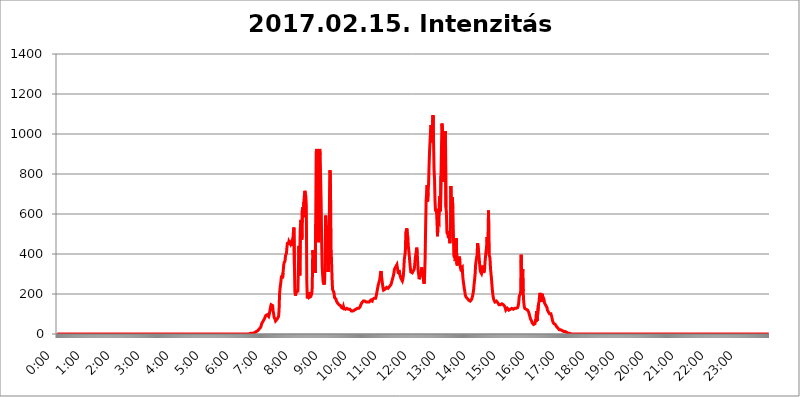
| Category | 2017.02.15. Intenzitás [W/m^2] |
|---|---|
| 0.0 | 0 |
| 0.0006944444444444445 | 0 |
| 0.001388888888888889 | 0 |
| 0.0020833333333333333 | 0 |
| 0.002777777777777778 | 0 |
| 0.003472222222222222 | 0 |
| 0.004166666666666667 | 0 |
| 0.004861111111111111 | 0 |
| 0.005555555555555556 | 0 |
| 0.0062499999999999995 | 0 |
| 0.006944444444444444 | 0 |
| 0.007638888888888889 | 0 |
| 0.008333333333333333 | 0 |
| 0.009027777777777779 | 0 |
| 0.009722222222222222 | 0 |
| 0.010416666666666666 | 0 |
| 0.011111111111111112 | 0 |
| 0.011805555555555555 | 0 |
| 0.012499999999999999 | 0 |
| 0.013194444444444444 | 0 |
| 0.013888888888888888 | 0 |
| 0.014583333333333332 | 0 |
| 0.015277777777777777 | 0 |
| 0.015972222222222224 | 0 |
| 0.016666666666666666 | 0 |
| 0.017361111111111112 | 0 |
| 0.018055555555555557 | 0 |
| 0.01875 | 0 |
| 0.019444444444444445 | 0 |
| 0.02013888888888889 | 0 |
| 0.020833333333333332 | 0 |
| 0.02152777777777778 | 0 |
| 0.022222222222222223 | 0 |
| 0.02291666666666667 | 0 |
| 0.02361111111111111 | 0 |
| 0.024305555555555556 | 0 |
| 0.024999999999999998 | 0 |
| 0.025694444444444447 | 0 |
| 0.02638888888888889 | 0 |
| 0.027083333333333334 | 0 |
| 0.027777777777777776 | 0 |
| 0.02847222222222222 | 0 |
| 0.029166666666666664 | 0 |
| 0.029861111111111113 | 0 |
| 0.030555555555555555 | 0 |
| 0.03125 | 0 |
| 0.03194444444444445 | 0 |
| 0.03263888888888889 | 0 |
| 0.03333333333333333 | 0 |
| 0.034027777777777775 | 0 |
| 0.034722222222222224 | 0 |
| 0.035416666666666666 | 0 |
| 0.036111111111111115 | 0 |
| 0.03680555555555556 | 0 |
| 0.0375 | 0 |
| 0.03819444444444444 | 0 |
| 0.03888888888888889 | 0 |
| 0.03958333333333333 | 0 |
| 0.04027777777777778 | 0 |
| 0.04097222222222222 | 0 |
| 0.041666666666666664 | 0 |
| 0.042361111111111106 | 0 |
| 0.04305555555555556 | 0 |
| 0.043750000000000004 | 0 |
| 0.044444444444444446 | 0 |
| 0.04513888888888889 | 0 |
| 0.04583333333333334 | 0 |
| 0.04652777777777778 | 0 |
| 0.04722222222222222 | 0 |
| 0.04791666666666666 | 0 |
| 0.04861111111111111 | 0 |
| 0.049305555555555554 | 0 |
| 0.049999999999999996 | 0 |
| 0.05069444444444445 | 0 |
| 0.051388888888888894 | 0 |
| 0.052083333333333336 | 0 |
| 0.05277777777777778 | 0 |
| 0.05347222222222222 | 0 |
| 0.05416666666666667 | 0 |
| 0.05486111111111111 | 0 |
| 0.05555555555555555 | 0 |
| 0.05625 | 0 |
| 0.05694444444444444 | 0 |
| 0.057638888888888885 | 0 |
| 0.05833333333333333 | 0 |
| 0.05902777777777778 | 0 |
| 0.059722222222222225 | 0 |
| 0.06041666666666667 | 0 |
| 0.061111111111111116 | 0 |
| 0.06180555555555556 | 0 |
| 0.0625 | 0 |
| 0.06319444444444444 | 0 |
| 0.06388888888888888 | 0 |
| 0.06458333333333334 | 0 |
| 0.06527777777777778 | 0 |
| 0.06597222222222222 | 0 |
| 0.06666666666666667 | 0 |
| 0.06736111111111111 | 0 |
| 0.06805555555555555 | 0 |
| 0.06874999999999999 | 0 |
| 0.06944444444444443 | 0 |
| 0.07013888888888889 | 0 |
| 0.07083333333333333 | 0 |
| 0.07152777777777779 | 0 |
| 0.07222222222222223 | 0 |
| 0.07291666666666667 | 0 |
| 0.07361111111111111 | 0 |
| 0.07430555555555556 | 0 |
| 0.075 | 0 |
| 0.07569444444444444 | 0 |
| 0.0763888888888889 | 0 |
| 0.07708333333333334 | 0 |
| 0.07777777777777778 | 0 |
| 0.07847222222222222 | 0 |
| 0.07916666666666666 | 0 |
| 0.0798611111111111 | 0 |
| 0.08055555555555556 | 0 |
| 0.08125 | 0 |
| 0.08194444444444444 | 0 |
| 0.08263888888888889 | 0 |
| 0.08333333333333333 | 0 |
| 0.08402777777777777 | 0 |
| 0.08472222222222221 | 0 |
| 0.08541666666666665 | 0 |
| 0.08611111111111112 | 0 |
| 0.08680555555555557 | 0 |
| 0.08750000000000001 | 0 |
| 0.08819444444444445 | 0 |
| 0.08888888888888889 | 0 |
| 0.08958333333333333 | 0 |
| 0.09027777777777778 | 0 |
| 0.09097222222222222 | 0 |
| 0.09166666666666667 | 0 |
| 0.09236111111111112 | 0 |
| 0.09305555555555556 | 0 |
| 0.09375 | 0 |
| 0.09444444444444444 | 0 |
| 0.09513888888888888 | 0 |
| 0.09583333333333333 | 0 |
| 0.09652777777777777 | 0 |
| 0.09722222222222222 | 0 |
| 0.09791666666666667 | 0 |
| 0.09861111111111111 | 0 |
| 0.09930555555555555 | 0 |
| 0.09999999999999999 | 0 |
| 0.10069444444444443 | 0 |
| 0.1013888888888889 | 0 |
| 0.10208333333333335 | 0 |
| 0.10277777777777779 | 0 |
| 0.10347222222222223 | 0 |
| 0.10416666666666667 | 0 |
| 0.10486111111111111 | 0 |
| 0.10555555555555556 | 0 |
| 0.10625 | 0 |
| 0.10694444444444444 | 0 |
| 0.1076388888888889 | 0 |
| 0.10833333333333334 | 0 |
| 0.10902777777777778 | 0 |
| 0.10972222222222222 | 0 |
| 0.1111111111111111 | 0 |
| 0.11180555555555556 | 0 |
| 0.11180555555555556 | 0 |
| 0.1125 | 0 |
| 0.11319444444444444 | 0 |
| 0.11388888888888889 | 0 |
| 0.11458333333333333 | 0 |
| 0.11527777777777777 | 0 |
| 0.11597222222222221 | 0 |
| 0.11666666666666665 | 0 |
| 0.1173611111111111 | 0 |
| 0.11805555555555557 | 0 |
| 0.11944444444444445 | 0 |
| 0.12013888888888889 | 0 |
| 0.12083333333333333 | 0 |
| 0.12152777777777778 | 0 |
| 0.12222222222222223 | 0 |
| 0.12291666666666667 | 0 |
| 0.12291666666666667 | 0 |
| 0.12361111111111112 | 0 |
| 0.12430555555555556 | 0 |
| 0.125 | 0 |
| 0.12569444444444444 | 0 |
| 0.12638888888888888 | 0 |
| 0.12708333333333333 | 0 |
| 0.16875 | 0 |
| 0.12847222222222224 | 0 |
| 0.12916666666666668 | 0 |
| 0.12986111111111112 | 0 |
| 0.13055555555555556 | 0 |
| 0.13125 | 0 |
| 0.13194444444444445 | 0 |
| 0.1326388888888889 | 0 |
| 0.13333333333333333 | 0 |
| 0.13402777777777777 | 0 |
| 0.13402777777777777 | 0 |
| 0.13472222222222222 | 0 |
| 0.13541666666666666 | 0 |
| 0.1361111111111111 | 0 |
| 0.13749999999999998 | 0 |
| 0.13819444444444443 | 0 |
| 0.1388888888888889 | 0 |
| 0.13958333333333334 | 0 |
| 0.14027777777777778 | 0 |
| 0.14097222222222222 | 0 |
| 0.14166666666666666 | 0 |
| 0.1423611111111111 | 0 |
| 0.14305555555555557 | 0 |
| 0.14375000000000002 | 0 |
| 0.14444444444444446 | 0 |
| 0.1451388888888889 | 0 |
| 0.1451388888888889 | 0 |
| 0.14652777777777778 | 0 |
| 0.14722222222222223 | 0 |
| 0.14791666666666667 | 0 |
| 0.1486111111111111 | 0 |
| 0.14930555555555555 | 0 |
| 0.15 | 0 |
| 0.15069444444444444 | 0 |
| 0.15138888888888888 | 0 |
| 0.15208333333333332 | 0 |
| 0.15277777777777776 | 0 |
| 0.15347222222222223 | 0 |
| 0.15416666666666667 | 0 |
| 0.15486111111111112 | 0 |
| 0.15555555555555556 | 0 |
| 0.15625 | 0 |
| 0.15694444444444444 | 0 |
| 0.15763888888888888 | 0 |
| 0.15833333333333333 | 0 |
| 0.15902777777777777 | 0 |
| 0.15972222222222224 | 0 |
| 0.16041666666666668 | 0 |
| 0.16111111111111112 | 0 |
| 0.16180555555555556 | 0 |
| 0.1625 | 0 |
| 0.16319444444444445 | 0 |
| 0.1638888888888889 | 0 |
| 0.16458333333333333 | 0 |
| 0.16527777777777777 | 0 |
| 0.16597222222222222 | 0 |
| 0.16666666666666666 | 0 |
| 0.1673611111111111 | 0 |
| 0.16805555555555554 | 0 |
| 0.16874999999999998 | 0 |
| 0.16944444444444443 | 0 |
| 0.17013888888888887 | 0 |
| 0.1708333333333333 | 0 |
| 0.17152777777777775 | 0 |
| 0.17222222222222225 | 0 |
| 0.1729166666666667 | 0 |
| 0.17361111111111113 | 0 |
| 0.17430555555555557 | 0 |
| 0.17500000000000002 | 0 |
| 0.17569444444444446 | 0 |
| 0.1763888888888889 | 0 |
| 0.17708333333333334 | 0 |
| 0.17777777777777778 | 0 |
| 0.17847222222222223 | 0 |
| 0.17916666666666667 | 0 |
| 0.1798611111111111 | 0 |
| 0.18055555555555555 | 0 |
| 0.18125 | 0 |
| 0.18194444444444444 | 0 |
| 0.1826388888888889 | 0 |
| 0.18333333333333335 | 0 |
| 0.1840277777777778 | 0 |
| 0.18472222222222223 | 0 |
| 0.18541666666666667 | 0 |
| 0.18611111111111112 | 0 |
| 0.18680555555555556 | 0 |
| 0.1875 | 0 |
| 0.18819444444444444 | 0 |
| 0.18888888888888888 | 0 |
| 0.18958333333333333 | 0 |
| 0.19027777777777777 | 0 |
| 0.1909722222222222 | 0 |
| 0.19166666666666665 | 0 |
| 0.19236111111111112 | 0 |
| 0.19305555555555554 | 0 |
| 0.19375 | 0 |
| 0.19444444444444445 | 0 |
| 0.1951388888888889 | 0 |
| 0.19583333333333333 | 0 |
| 0.19652777777777777 | 0 |
| 0.19722222222222222 | 0 |
| 0.19791666666666666 | 0 |
| 0.1986111111111111 | 0 |
| 0.19930555555555554 | 0 |
| 0.19999999999999998 | 0 |
| 0.20069444444444443 | 0 |
| 0.20138888888888887 | 0 |
| 0.2020833333333333 | 0 |
| 0.2027777777777778 | 0 |
| 0.2034722222222222 | 0 |
| 0.2041666666666667 | 0 |
| 0.20486111111111113 | 0 |
| 0.20555555555555557 | 0 |
| 0.20625000000000002 | 0 |
| 0.20694444444444446 | 0 |
| 0.2076388888888889 | 0 |
| 0.20833333333333334 | 0 |
| 0.20902777777777778 | 0 |
| 0.20972222222222223 | 0 |
| 0.21041666666666667 | 0 |
| 0.2111111111111111 | 0 |
| 0.21180555555555555 | 0 |
| 0.2125 | 0 |
| 0.21319444444444444 | 0 |
| 0.2138888888888889 | 0 |
| 0.21458333333333335 | 0 |
| 0.2152777777777778 | 0 |
| 0.21597222222222223 | 0 |
| 0.21666666666666667 | 0 |
| 0.21736111111111112 | 0 |
| 0.21805555555555556 | 0 |
| 0.21875 | 0 |
| 0.21944444444444444 | 0 |
| 0.22013888888888888 | 0 |
| 0.22083333333333333 | 0 |
| 0.22152777777777777 | 0 |
| 0.2222222222222222 | 0 |
| 0.22291666666666665 | 0 |
| 0.2236111111111111 | 0 |
| 0.22430555555555556 | 0 |
| 0.225 | 0 |
| 0.22569444444444445 | 0 |
| 0.2263888888888889 | 0 |
| 0.22708333333333333 | 0 |
| 0.22777777777777777 | 0 |
| 0.22847222222222222 | 0 |
| 0.22916666666666666 | 0 |
| 0.2298611111111111 | 0 |
| 0.23055555555555554 | 0 |
| 0.23124999999999998 | 0 |
| 0.23194444444444443 | 0 |
| 0.23263888888888887 | 0 |
| 0.2333333333333333 | 0 |
| 0.2340277777777778 | 0 |
| 0.2347222222222222 | 0 |
| 0.2354166666666667 | 0 |
| 0.23611111111111113 | 0 |
| 0.23680555555555557 | 0 |
| 0.23750000000000002 | 0 |
| 0.23819444444444446 | 0 |
| 0.2388888888888889 | 0 |
| 0.23958333333333334 | 0 |
| 0.24027777777777778 | 0 |
| 0.24097222222222223 | 0 |
| 0.24166666666666667 | 0 |
| 0.2423611111111111 | 0 |
| 0.24305555555555555 | 0 |
| 0.24375 | 0 |
| 0.24444444444444446 | 0 |
| 0.24513888888888888 | 0 |
| 0.24583333333333335 | 0 |
| 0.2465277777777778 | 0 |
| 0.24722222222222223 | 0 |
| 0.24791666666666667 | 0 |
| 0.24861111111111112 | 0 |
| 0.24930555555555556 | 0 |
| 0.25 | 0 |
| 0.25069444444444444 | 0 |
| 0.2513888888888889 | 0 |
| 0.2520833333333333 | 0 |
| 0.25277777777777777 | 0 |
| 0.2534722222222222 | 0 |
| 0.25416666666666665 | 0 |
| 0.2548611111111111 | 0 |
| 0.2555555555555556 | 0 |
| 0.25625000000000003 | 0 |
| 0.2569444444444445 | 0 |
| 0.2576388888888889 | 0 |
| 0.25833333333333336 | 0 |
| 0.2590277777777778 | 0 |
| 0.25972222222222224 | 0 |
| 0.2604166666666667 | 0 |
| 0.2611111111111111 | 0 |
| 0.26180555555555557 | 0 |
| 0.2625 | 0 |
| 0.26319444444444445 | 0 |
| 0.2638888888888889 | 0 |
| 0.26458333333333334 | 0 |
| 0.2652777777777778 | 0 |
| 0.2659722222222222 | 0 |
| 0.26666666666666666 | 0 |
| 0.2673611111111111 | 0 |
| 0.26805555555555555 | 0 |
| 0.26875 | 0 |
| 0.26944444444444443 | 0 |
| 0.2701388888888889 | 0 |
| 0.2708333333333333 | 3.525 |
| 0.27152777777777776 | 0 |
| 0.2722222222222222 | 3.525 |
| 0.27291666666666664 | 3.525 |
| 0.2736111111111111 | 3.525 |
| 0.2743055555555555 | 3.525 |
| 0.27499999999999997 | 3.525 |
| 0.27569444444444446 | 3.525 |
| 0.27638888888888885 | 3.525 |
| 0.27708333333333335 | 7.887 |
| 0.2777777777777778 | 7.887 |
| 0.27847222222222223 | 7.887 |
| 0.2791666666666667 | 12.257 |
| 0.2798611111111111 | 12.257 |
| 0.28055555555555556 | 16.636 |
| 0.28125 | 16.636 |
| 0.28194444444444444 | 21.024 |
| 0.2826388888888889 | 21.024 |
| 0.2833333333333333 | 25.419 |
| 0.28402777777777777 | 25.419 |
| 0.2847222222222222 | 29.823 |
| 0.28541666666666665 | 34.234 |
| 0.28611111111111115 | 43.079 |
| 0.28680555555555554 | 51.951 |
| 0.28750000000000003 | 56.398 |
| 0.2881944444444445 | 60.85 |
| 0.2888888888888889 | 65.31 |
| 0.28958333333333336 | 69.775 |
| 0.2902777777777778 | 74.246 |
| 0.29097222222222224 | 78.722 |
| 0.2916666666666667 | 83.205 |
| 0.2923611111111111 | 92.184 |
| 0.29305555555555557 | 96.682 |
| 0.29375 | 96.682 |
| 0.29444444444444445 | 96.682 |
| 0.2951388888888889 | 101.184 |
| 0.29583333333333334 | 92.184 |
| 0.2965277777777778 | 87.692 |
| 0.2972222222222222 | 96.682 |
| 0.29791666666666666 | 110.201 |
| 0.2986111111111111 | 123.758 |
| 0.29930555555555555 | 137.347 |
| 0.3 | 146.423 |
| 0.30069444444444443 | 150.964 |
| 0.3013888888888889 | 150.964 |
| 0.3020833333333333 | 141.884 |
| 0.30277777777777776 | 114.716 |
| 0.3034722222222222 | 101.184 |
| 0.30416666666666664 | 83.205 |
| 0.3048611111111111 | 78.722 |
| 0.3055555555555555 | 74.246 |
| 0.30624999999999997 | 65.31 |
| 0.3069444444444444 | 69.775 |
| 0.3076388888888889 | 69.775 |
| 0.30833333333333335 | 74.246 |
| 0.3090277777777778 | 74.246 |
| 0.30972222222222223 | 78.722 |
| 0.3104166666666667 | 87.692 |
| 0.3111111111111111 | 119.235 |
| 0.31180555555555556 | 201.058 |
| 0.3125 | 228.436 |
| 0.31319444444444444 | 246.689 |
| 0.3138888888888889 | 269.49 |
| 0.3145833333333333 | 292.259 |
| 0.31527777777777777 | 287.709 |
| 0.3159722222222222 | 278.603 |
| 0.31666666666666665 | 305.898 |
| 0.31736111111111115 | 333.113 |
| 0.31805555555555554 | 355.712 |
| 0.31875000000000003 | 351.198 |
| 0.3194444444444445 | 364.728 |
| 0.3201388888888889 | 391.685 |
| 0.32083333333333336 | 387.202 |
| 0.3215277777777778 | 405.108 |
| 0.32222222222222224 | 436.27 |
| 0.3229166666666667 | 458.38 |
| 0.3236111111111111 | 462.786 |
| 0.32430555555555557 | 445.129 |
| 0.325 | 462.786 |
| 0.32569444444444445 | 458.38 |
| 0.3263888888888889 | 458.38 |
| 0.32708333333333334 | 449.551 |
| 0.3277777777777778 | 458.38 |
| 0.3284722222222222 | 462.786 |
| 0.32916666666666666 | 467.187 |
| 0.3298611111111111 | 440.702 |
| 0.33055555555555555 | 475.972 |
| 0.33125 | 510.885 |
| 0.33194444444444443 | 532.513 |
| 0.3326388888888889 | 346.682 |
| 0.3333333333333333 | 210.182 |
| 0.3340277777777778 | 191.937 |
| 0.3347222222222222 | 191.937 |
| 0.3354166666666667 | 214.746 |
| 0.3361111111111111 | 210.182 |
| 0.3368055555555556 | 214.746 |
| 0.33749999999999997 | 214.746 |
| 0.33819444444444446 | 219.309 |
| 0.33888888888888885 | 440.702 |
| 0.33958333333333335 | 378.224 |
| 0.34027777777777773 | 292.259 |
| 0.34097222222222223 | 528.2 |
| 0.3416666666666666 | 571.049 |
| 0.3423611111111111 | 549.704 |
| 0.3430555555555555 | 471.582 |
| 0.34375 | 617.436 |
| 0.3444444444444445 | 634.105 |
| 0.3451388888888889 | 583.779 |
| 0.3458333333333334 | 658.909 |
| 0.34652777777777777 | 687.544 |
| 0.34722222222222227 | 715.858 |
| 0.34791666666666665 | 699.717 |
| 0.34861111111111115 | 691.608 |
| 0.34930555555555554 | 642.4 |
| 0.35000000000000003 | 264.932 |
| 0.3506944444444444 | 178.264 |
| 0.3513888888888889 | 182.82 |
| 0.3520833333333333 | 201.058 |
| 0.3527777777777778 | 210.182 |
| 0.3534722222222222 | 182.82 |
| 0.3541666666666667 | 187.378 |
| 0.3548611111111111 | 187.378 |
| 0.35555555555555557 | 187.378 |
| 0.35625 | 191.937 |
| 0.35694444444444445 | 201.058 |
| 0.3576388888888889 | 233 |
| 0.35833333333333334 | 418.492 |
| 0.3590277777777778 | 396.164 |
| 0.3597222222222222 | 414.035 |
| 0.36041666666666666 | 355.712 |
| 0.3611111111111111 | 400.638 |
| 0.36180555555555555 | 305.898 |
| 0.3625 | 549.704 |
| 0.36319444444444443 | 909.996 |
| 0.3638888888888889 | 925.06 |
| 0.3645833333333333 | 921.298 |
| 0.3652777777777778 | 868.305 |
| 0.3659722222222222 | 579.542 |
| 0.3666666666666667 | 458.38 |
| 0.3673611111111111 | 909.996 |
| 0.3680555555555556 | 925.06 |
| 0.36874999999999997 | 894.885 |
| 0.36944444444444446 | 894.885 |
| 0.37013888888888885 | 654.791 |
| 0.37083333333333335 | 462.786 |
| 0.37152777777777773 | 337.639 |
| 0.37222222222222223 | 296.808 |
| 0.3729166666666666 | 260.373 |
| 0.3736111111111111 | 255.813 |
| 0.3743055555555555 | 246.689 |
| 0.375 | 264.932 |
| 0.3756944444444445 | 369.23 |
| 0.3763888888888889 | 592.233 |
| 0.3770833333333334 | 549.704 |
| 0.37777777777777777 | 541.121 |
| 0.37847222222222227 | 355.712 |
| 0.37916666666666665 | 378.224 |
| 0.37986111111111115 | 310.44 |
| 0.38055555555555554 | 346.682 |
| 0.38125000000000003 | 405.108 |
| 0.3819444444444444 | 727.896 |
| 0.3826388888888889 | 818.392 |
| 0.3833333333333333 | 703.762 |
| 0.3840277777777778 | 431.833 |
| 0.3847222222222222 | 360.221 |
| 0.3854166666666667 | 278.603 |
| 0.3861111111111111 | 223.873 |
| 0.38680555555555557 | 219.309 |
| 0.3875 | 223.873 |
| 0.38819444444444445 | 205.62 |
| 0.3888888888888889 | 182.82 |
| 0.38958333333333334 | 178.264 |
| 0.3902777777777778 | 178.264 |
| 0.3909722222222222 | 173.709 |
| 0.39166666666666666 | 164.605 |
| 0.3923611111111111 | 160.056 |
| 0.39305555555555555 | 155.509 |
| 0.39375 | 150.964 |
| 0.39444444444444443 | 150.964 |
| 0.3951388888888889 | 146.423 |
| 0.3958333333333333 | 146.423 |
| 0.3965277777777778 | 141.884 |
| 0.3972222222222222 | 141.884 |
| 0.3979166666666667 | 137.347 |
| 0.3986111111111111 | 132.814 |
| 0.3993055555555556 | 132.814 |
| 0.39999999999999997 | 128.284 |
| 0.40069444444444446 | 128.284 |
| 0.40138888888888885 | 137.347 |
| 0.40208333333333335 | 128.284 |
| 0.40277777777777773 | 123.758 |
| 0.40347222222222223 | 123.758 |
| 0.4041666666666666 | 123.758 |
| 0.4048611111111111 | 123.758 |
| 0.4055555555555555 | 123.758 |
| 0.40625 | 128.284 |
| 0.4069444444444445 | 123.758 |
| 0.4076388888888889 | 123.758 |
| 0.4083333333333334 | 123.758 |
| 0.40902777777777777 | 123.758 |
| 0.40972222222222227 | 123.758 |
| 0.41041666666666665 | 123.758 |
| 0.41111111111111115 | 119.235 |
| 0.41180555555555554 | 119.235 |
| 0.41250000000000003 | 114.716 |
| 0.4131944444444444 | 114.716 |
| 0.4138888888888889 | 114.716 |
| 0.4145833333333333 | 114.716 |
| 0.4152777777777778 | 114.716 |
| 0.4159722222222222 | 114.716 |
| 0.4166666666666667 | 119.235 |
| 0.4173611111111111 | 119.235 |
| 0.41805555555555557 | 119.235 |
| 0.41875 | 123.758 |
| 0.41944444444444445 | 123.758 |
| 0.4201388888888889 | 123.758 |
| 0.42083333333333334 | 128.284 |
| 0.4215277777777778 | 128.284 |
| 0.4222222222222222 | 128.284 |
| 0.42291666666666666 | 128.284 |
| 0.4236111111111111 | 128.284 |
| 0.42430555555555555 | 132.814 |
| 0.425 | 137.347 |
| 0.42569444444444443 | 146.423 |
| 0.4263888888888889 | 150.964 |
| 0.4270833333333333 | 155.509 |
| 0.4277777777777778 | 155.509 |
| 0.4284722222222222 | 160.056 |
| 0.4291666666666667 | 164.605 |
| 0.4298611111111111 | 164.605 |
| 0.4305555555555556 | 164.605 |
| 0.43124999999999997 | 164.605 |
| 0.43194444444444446 | 164.605 |
| 0.43263888888888885 | 164.605 |
| 0.43333333333333335 | 160.056 |
| 0.43402777777777773 | 160.056 |
| 0.43472222222222223 | 160.056 |
| 0.4354166666666666 | 160.056 |
| 0.4361111111111111 | 160.056 |
| 0.4368055555555555 | 160.056 |
| 0.4375 | 160.056 |
| 0.4381944444444445 | 164.605 |
| 0.4388888888888889 | 164.605 |
| 0.4395833333333334 | 169.156 |
| 0.44027777777777777 | 169.156 |
| 0.44097222222222227 | 164.605 |
| 0.44166666666666665 | 164.605 |
| 0.44236111111111115 | 173.709 |
| 0.44305555555555554 | 169.156 |
| 0.44375000000000003 | 173.709 |
| 0.4444444444444444 | 178.264 |
| 0.4451388888888889 | 178.264 |
| 0.4458333333333333 | 173.709 |
| 0.4465277777777778 | 178.264 |
| 0.4472222222222222 | 187.378 |
| 0.4479166666666667 | 201.058 |
| 0.4486111111111111 | 214.746 |
| 0.44930555555555557 | 228.436 |
| 0.45 | 242.127 |
| 0.45069444444444445 | 251.251 |
| 0.4513888888888889 | 260.373 |
| 0.45208333333333334 | 269.49 |
| 0.4527777777777778 | 283.156 |
| 0.4534722222222222 | 305.898 |
| 0.45416666666666666 | 314.98 |
| 0.4548611111111111 | 287.709 |
| 0.45555555555555555 | 269.49 |
| 0.45625 | 246.689 |
| 0.45694444444444443 | 228.436 |
| 0.4576388888888889 | 219.309 |
| 0.4583333333333333 | 219.309 |
| 0.4590277777777778 | 219.309 |
| 0.4597222222222222 | 223.873 |
| 0.4604166666666667 | 228.436 |
| 0.4611111111111111 | 228.436 |
| 0.4618055555555556 | 233 |
| 0.46249999999999997 | 237.564 |
| 0.46319444444444446 | 233 |
| 0.46388888888888885 | 228.436 |
| 0.46458333333333335 | 228.436 |
| 0.46527777777777773 | 233 |
| 0.46597222222222223 | 237.564 |
| 0.4666666666666666 | 242.127 |
| 0.4673611111111111 | 242.127 |
| 0.4680555555555555 | 246.689 |
| 0.46875 | 255.813 |
| 0.4694444444444445 | 264.932 |
| 0.4701388888888889 | 274.047 |
| 0.4708333333333334 | 283.156 |
| 0.47152777777777777 | 292.259 |
| 0.47222222222222227 | 305.898 |
| 0.47291666666666665 | 324.052 |
| 0.47361111111111115 | 328.584 |
| 0.47430555555555554 | 333.113 |
| 0.47500000000000003 | 337.639 |
| 0.4756944444444444 | 337.639 |
| 0.4763888888888889 | 346.682 |
| 0.4770833333333333 | 342.162 |
| 0.4777777777777778 | 314.98 |
| 0.4784722222222222 | 301.354 |
| 0.4791666666666667 | 319.517 |
| 0.4798611111111111 | 314.98 |
| 0.48055555555555557 | 296.808 |
| 0.48125 | 287.709 |
| 0.48194444444444445 | 278.603 |
| 0.4826388888888889 | 278.603 |
| 0.48333333333333334 | 278.603 |
| 0.4840277777777778 | 264.932 |
| 0.4847222222222222 | 274.047 |
| 0.48541666666666666 | 292.259 |
| 0.4861111111111111 | 328.584 |
| 0.48680555555555555 | 373.729 |
| 0.4875 | 391.685 |
| 0.48819444444444443 | 409.574 |
| 0.4888888888888889 | 506.542 |
| 0.4895833333333333 | 506.542 |
| 0.4902777777777778 | 528.2 |
| 0.4909722222222222 | 497.836 |
| 0.4916666666666667 | 489.108 |
| 0.4923611111111111 | 440.702 |
| 0.4930555555555556 | 418.492 |
| 0.49374999999999997 | 391.685 |
| 0.49444444444444446 | 360.221 |
| 0.49513888888888885 | 333.113 |
| 0.49583333333333335 | 310.44 |
| 0.49652777777777773 | 305.898 |
| 0.49722222222222223 | 305.898 |
| 0.4979166666666666 | 305.898 |
| 0.4986111111111111 | 310.44 |
| 0.4993055555555555 | 314.98 |
| 0.5 | 314.98 |
| 0.5006944444444444 | 324.052 |
| 0.5013888888888889 | 346.682 |
| 0.5020833333333333 | 378.224 |
| 0.5027777777777778 | 378.224 |
| 0.5034722222222222 | 409.574 |
| 0.5041666666666667 | 431.833 |
| 0.5048611111111111 | 405.108 |
| 0.5055555555555555 | 355.712 |
| 0.50625 | 314.98 |
| 0.5069444444444444 | 296.808 |
| 0.5076388888888889 | 274.047 |
| 0.5083333333333333 | 269.49 |
| 0.5090277777777777 | 292.259 |
| 0.5097222222222222 | 296.808 |
| 0.5104166666666666 | 314.98 |
| 0.5111111111111112 | 333.113 |
| 0.5118055555555555 | 328.584 |
| 0.5125000000000001 | 333.113 |
| 0.5131944444444444 | 287.709 |
| 0.513888888888889 | 260.373 |
| 0.5145833333333333 | 251.251 |
| 0.5152777777777778 | 292.259 |
| 0.5159722222222222 | 378.224 |
| 0.5166666666666667 | 532.513 |
| 0.517361111111111 | 667.123 |
| 0.5180555555555556 | 703.762 |
| 0.5187499999999999 | 743.859 |
| 0.5194444444444445 | 663.019 |
| 0.5201388888888888 | 707.8 |
| 0.5208333333333334 | 751.803 |
| 0.5215277777777778 | 845.365 |
| 0.5222222222222223 | 917.534 |
| 0.5229166666666667 | 966.295 |
| 0.5236111111111111 | 1018.587 |
| 0.5243055555555556 | 1044.762 |
| 0.525 | 958.814 |
| 0.5256944444444445 | 1041.019 |
| 0.5263888888888889 | 1033.537 |
| 0.5270833333333333 | 1093.653 |
| 0.5277777777777778 | 966.295 |
| 0.5284722222222222 | 822.26 |
| 0.5291666666666667 | 775.492 |
| 0.5298611111111111 | 663.019 |
| 0.5305555555555556 | 613.252 |
| 0.53125 | 625.784 |
| 0.5319444444444444 | 613.252 |
| 0.5326388888888889 | 558.261 |
| 0.5333333333333333 | 489.108 |
| 0.5340277777777778 | 566.793 |
| 0.5347222222222222 | 566.793 |
| 0.5354166666666667 | 558.261 |
| 0.5361111111111111 | 687.544 |
| 0.5368055555555555 | 687.544 |
| 0.5375 | 613.252 |
| 0.5381944444444444 | 791.169 |
| 0.5388888888888889 | 928.819 |
| 0.5395833333333333 | 1052.255 |
| 0.5402777777777777 | 1014.852 |
| 0.5409722222222222 | 798.974 |
| 0.5416666666666666 | 977.508 |
| 0.5423611111111112 | 759.723 |
| 0.5430555555555555 | 759.723 |
| 0.5437500000000001 | 887.309 |
| 0.5444444444444444 | 1014.852 |
| 0.545138888888889 | 634.105 |
| 0.5458333333333333 | 609.062 |
| 0.5465277777777778 | 506.542 |
| 0.5472222222222222 | 506.542 |
| 0.5479166666666667 | 497.836 |
| 0.548611111111111 | 480.356 |
| 0.5493055555555556 | 515.223 |
| 0.5499999999999999 | 475.972 |
| 0.5506944444444445 | 453.968 |
| 0.5513888888888888 | 506.542 |
| 0.5520833333333334 | 739.877 |
| 0.5527777777777778 | 528.2 |
| 0.5534722222222223 | 523.88 |
| 0.5541666666666667 | 683.473 |
| 0.5548611111111111 | 625.784 |
| 0.5555555555555556 | 625.784 |
| 0.55625 | 391.685 |
| 0.5569444444444445 | 382.715 |
| 0.5576388888888889 | 396.164 |
| 0.5583333333333333 | 364.728 |
| 0.5590277777777778 | 360.221 |
| 0.5597222222222222 | 480.356 |
| 0.5604166666666667 | 351.198 |
| 0.5611111111111111 | 342.162 |
| 0.5618055555555556 | 369.23 |
| 0.5625 | 360.221 |
| 0.5631944444444444 | 378.224 |
| 0.5638888888888889 | 387.202 |
| 0.5645833333333333 | 369.23 |
| 0.5652777777777778 | 333.113 |
| 0.5659722222222222 | 324.052 |
| 0.5666666666666667 | 324.052 |
| 0.5673611111111111 | 319.517 |
| 0.5680555555555555 | 333.113 |
| 0.56875 | 287.709 |
| 0.5694444444444444 | 264.932 |
| 0.5701388888888889 | 246.689 |
| 0.5708333333333333 | 228.436 |
| 0.5715277777777777 | 214.746 |
| 0.5722222222222222 | 196.497 |
| 0.5729166666666666 | 187.378 |
| 0.5736111111111112 | 191.937 |
| 0.5743055555555555 | 187.378 |
| 0.5750000000000001 | 178.264 |
| 0.5756944444444444 | 173.709 |
| 0.576388888888889 | 173.709 |
| 0.5770833333333333 | 169.156 |
| 0.5777777777777778 | 169.156 |
| 0.5784722222222222 | 169.156 |
| 0.5791666666666667 | 164.605 |
| 0.579861111111111 | 164.605 |
| 0.5805555555555556 | 164.605 |
| 0.5812499999999999 | 173.709 |
| 0.5819444444444445 | 182.82 |
| 0.5826388888888888 | 191.937 |
| 0.5833333333333334 | 205.62 |
| 0.5840277777777778 | 223.873 |
| 0.5847222222222223 | 251.251 |
| 0.5854166666666667 | 274.047 |
| 0.5861111111111111 | 301.354 |
| 0.5868055555555556 | 346.682 |
| 0.5875 | 364.728 |
| 0.5881944444444445 | 382.715 |
| 0.5888888888888889 | 396.164 |
| 0.5895833333333333 | 453.968 |
| 0.5902777777777778 | 458.38 |
| 0.5909722222222222 | 409.574 |
| 0.5916666666666667 | 382.715 |
| 0.5923611111111111 | 351.198 |
| 0.5930555555555556 | 324.052 |
| 0.59375 | 310.44 |
| 0.5944444444444444 | 305.898 |
| 0.5951388888888889 | 301.354 |
| 0.5958333333333333 | 310.44 |
| 0.5965277777777778 | 342.162 |
| 0.5972222222222222 | 328.584 |
| 0.5979166666666667 | 305.898 |
| 0.5986111111111111 | 310.44 |
| 0.5993055555555555 | 319.517 |
| 0.6 | 360.221 |
| 0.6006944444444444 | 387.202 |
| 0.6013888888888889 | 414.035 |
| 0.6020833333333333 | 431.833 |
| 0.6027777777777777 | 484.735 |
| 0.6034722222222222 | 453.968 |
| 0.6041666666666666 | 480.356 |
| 0.6048611111111112 | 617.436 |
| 0.6055555555555555 | 400.638 |
| 0.6062500000000001 | 405.108 |
| 0.6069444444444444 | 378.224 |
| 0.607638888888889 | 328.584 |
| 0.6083333333333333 | 301.354 |
| 0.6090277777777778 | 278.603 |
| 0.6097222222222222 | 242.127 |
| 0.6104166666666667 | 214.746 |
| 0.611111111111111 | 191.937 |
| 0.6118055555555556 | 178.264 |
| 0.6124999999999999 | 169.156 |
| 0.6131944444444445 | 164.605 |
| 0.6138888888888888 | 160.056 |
| 0.6145833333333334 | 160.056 |
| 0.6152777777777778 | 160.056 |
| 0.6159722222222223 | 164.605 |
| 0.6166666666666667 | 164.605 |
| 0.6173611111111111 | 160.056 |
| 0.6180555555555556 | 155.509 |
| 0.61875 | 150.964 |
| 0.6194444444444445 | 146.423 |
| 0.6201388888888889 | 146.423 |
| 0.6208333333333333 | 146.423 |
| 0.6215277777777778 | 146.423 |
| 0.6222222222222222 | 146.423 |
| 0.6229166666666667 | 146.423 |
| 0.6236111111111111 | 150.964 |
| 0.6243055555555556 | 150.964 |
| 0.625 | 150.964 |
| 0.6256944444444444 | 146.423 |
| 0.6263888888888889 | 146.423 |
| 0.6270833333333333 | 146.423 |
| 0.6277777777777778 | 137.347 |
| 0.6284722222222222 | 128.284 |
| 0.6291666666666667 | 119.235 |
| 0.6298611111111111 | 119.235 |
| 0.6305555555555555 | 123.758 |
| 0.63125 | 128.284 |
| 0.6319444444444444 | 128.284 |
| 0.6326388888888889 | 123.758 |
| 0.6333333333333333 | 119.235 |
| 0.6340277777777777 | 119.235 |
| 0.6347222222222222 | 119.235 |
| 0.6354166666666666 | 123.758 |
| 0.6361111111111112 | 128.284 |
| 0.6368055555555555 | 128.284 |
| 0.6375000000000001 | 128.284 |
| 0.6381944444444444 | 128.284 |
| 0.638888888888889 | 123.758 |
| 0.6395833333333333 | 123.758 |
| 0.6402777777777778 | 123.758 |
| 0.6409722222222222 | 128.284 |
| 0.6416666666666667 | 128.284 |
| 0.642361111111111 | 128.284 |
| 0.6430555555555556 | 128.284 |
| 0.6437499999999999 | 128.284 |
| 0.6444444444444445 | 128.284 |
| 0.6451388888888888 | 128.284 |
| 0.6458333333333334 | 132.814 |
| 0.6465277777777778 | 141.884 |
| 0.6472222222222223 | 155.509 |
| 0.6479166666666667 | 187.378 |
| 0.6486111111111111 | 191.937 |
| 0.6493055555555556 | 201.058 |
| 0.65 | 214.746 |
| 0.6506944444444445 | 396.164 |
| 0.6513888888888889 | 196.497 |
| 0.6520833333333333 | 205.62 |
| 0.6527777777777778 | 324.052 |
| 0.6534722222222222 | 214.746 |
| 0.6541666666666667 | 164.605 |
| 0.6548611111111111 | 141.884 |
| 0.6555555555555556 | 128.284 |
| 0.65625 | 132.814 |
| 0.6569444444444444 | 123.758 |
| 0.6576388888888889 | 123.758 |
| 0.6583333333333333 | 123.758 |
| 0.6590277777777778 | 123.758 |
| 0.6597222222222222 | 119.235 |
| 0.6604166666666667 | 114.716 |
| 0.6611111111111111 | 110.201 |
| 0.6618055555555555 | 101.184 |
| 0.6625 | 92.184 |
| 0.6631944444444444 | 83.205 |
| 0.6638888888888889 | 74.246 |
| 0.6645833333333333 | 69.775 |
| 0.6652777777777777 | 65.31 |
| 0.6659722222222222 | 56.398 |
| 0.6666666666666666 | 56.398 |
| 0.6673611111111111 | 51.951 |
| 0.6680555555555556 | 47.511 |
| 0.6687500000000001 | 47.511 |
| 0.6694444444444444 | 47.511 |
| 0.6701388888888888 | 51.951 |
| 0.6708333333333334 | 74.246 |
| 0.6715277777777778 | 60.85 |
| 0.6722222222222222 | 114.716 |
| 0.6729166666666666 | 65.31 |
| 0.6736111111111112 | 60.85 |
| 0.6743055555555556 | 65.31 |
| 0.6749999999999999 | 150.964 |
| 0.6756944444444444 | 160.056 |
| 0.6763888888888889 | 187.378 |
| 0.6770833333333334 | 205.62 |
| 0.6777777777777777 | 210.182 |
| 0.6784722222222223 | 160.056 |
| 0.6791666666666667 | 155.509 |
| 0.6798611111111111 | 201.058 |
| 0.6805555555555555 | 191.937 |
| 0.68125 | 191.937 |
| 0.6819444444444445 | 187.378 |
| 0.6826388888888889 | 173.709 |
| 0.6833333333333332 | 155.509 |
| 0.6840277777777778 | 150.964 |
| 0.6847222222222222 | 150.964 |
| 0.6854166666666667 | 141.884 |
| 0.686111111111111 | 137.347 |
| 0.6868055555555556 | 132.814 |
| 0.6875 | 119.235 |
| 0.6881944444444444 | 114.716 |
| 0.688888888888889 | 110.201 |
| 0.6895833333333333 | 105.69 |
| 0.6902777777777778 | 101.184 |
| 0.6909722222222222 | 101.184 |
| 0.6916666666666668 | 101.184 |
| 0.6923611111111111 | 101.184 |
| 0.6930555555555555 | 96.682 |
| 0.69375 | 83.205 |
| 0.6944444444444445 | 69.775 |
| 0.6951388888888889 | 60.85 |
| 0.6958333333333333 | 56.398 |
| 0.6965277777777777 | 51.951 |
| 0.6972222222222223 | 47.511 |
| 0.6979166666666666 | 47.511 |
| 0.6986111111111111 | 47.511 |
| 0.6993055555555556 | 43.079 |
| 0.7000000000000001 | 38.653 |
| 0.7006944444444444 | 38.653 |
| 0.7013888888888888 | 34.234 |
| 0.7020833333333334 | 29.823 |
| 0.7027777777777778 | 25.419 |
| 0.7034722222222222 | 25.419 |
| 0.7041666666666666 | 21.024 |
| 0.7048611111111112 | 21.024 |
| 0.7055555555555556 | 21.024 |
| 0.7062499999999999 | 21.024 |
| 0.7069444444444444 | 21.024 |
| 0.7076388888888889 | 16.636 |
| 0.7083333333333334 | 16.636 |
| 0.7090277777777777 | 12.257 |
| 0.7097222222222223 | 12.257 |
| 0.7104166666666667 | 12.257 |
| 0.7111111111111111 | 12.257 |
| 0.7118055555555555 | 12.257 |
| 0.7125 | 12.257 |
| 0.7131944444444445 | 7.887 |
| 0.7138888888888889 | 7.887 |
| 0.7145833333333332 | 7.887 |
| 0.7152777777777778 | 3.525 |
| 0.7159722222222222 | 3.525 |
| 0.7166666666666667 | 3.525 |
| 0.717361111111111 | 3.525 |
| 0.7180555555555556 | 3.525 |
| 0.71875 | 3.525 |
| 0.7194444444444444 | 0 |
| 0.720138888888889 | 0 |
| 0.7208333333333333 | 0 |
| 0.7215277777777778 | 0 |
| 0.7222222222222222 | 0 |
| 0.7229166666666668 | 0 |
| 0.7236111111111111 | 0 |
| 0.7243055555555555 | 0 |
| 0.725 | 0 |
| 0.7256944444444445 | 0 |
| 0.7263888888888889 | 0 |
| 0.7270833333333333 | 0 |
| 0.7277777777777777 | 0 |
| 0.7284722222222223 | 0 |
| 0.7291666666666666 | 0 |
| 0.7298611111111111 | 0 |
| 0.7305555555555556 | 0 |
| 0.7312500000000001 | 0 |
| 0.7319444444444444 | 0 |
| 0.7326388888888888 | 0 |
| 0.7333333333333334 | 0 |
| 0.7340277777777778 | 0 |
| 0.7347222222222222 | 0 |
| 0.7354166666666666 | 0 |
| 0.7361111111111112 | 0 |
| 0.7368055555555556 | 0 |
| 0.7374999999999999 | 0 |
| 0.7381944444444444 | 0 |
| 0.7388888888888889 | 0 |
| 0.7395833333333334 | 0 |
| 0.7402777777777777 | 0 |
| 0.7409722222222223 | 0 |
| 0.7416666666666667 | 0 |
| 0.7423611111111111 | 0 |
| 0.7430555555555555 | 0 |
| 0.74375 | 0 |
| 0.7444444444444445 | 0 |
| 0.7451388888888889 | 0 |
| 0.7458333333333332 | 0 |
| 0.7465277777777778 | 0 |
| 0.7472222222222222 | 0 |
| 0.7479166666666667 | 0 |
| 0.748611111111111 | 0 |
| 0.7493055555555556 | 0 |
| 0.75 | 0 |
| 0.7506944444444444 | 0 |
| 0.751388888888889 | 0 |
| 0.7520833333333333 | 0 |
| 0.7527777777777778 | 0 |
| 0.7534722222222222 | 0 |
| 0.7541666666666668 | 0 |
| 0.7548611111111111 | 0 |
| 0.7555555555555555 | 0 |
| 0.75625 | 0 |
| 0.7569444444444445 | 0 |
| 0.7576388888888889 | 0 |
| 0.7583333333333333 | 0 |
| 0.7590277777777777 | 0 |
| 0.7597222222222223 | 0 |
| 0.7604166666666666 | 0 |
| 0.7611111111111111 | 0 |
| 0.7618055555555556 | 0 |
| 0.7625000000000001 | 0 |
| 0.7631944444444444 | 0 |
| 0.7638888888888888 | 0 |
| 0.7645833333333334 | 0 |
| 0.7652777777777778 | 0 |
| 0.7659722222222222 | 0 |
| 0.7666666666666666 | 0 |
| 0.7673611111111112 | 0 |
| 0.7680555555555556 | 0 |
| 0.7687499999999999 | 0 |
| 0.7694444444444444 | 0 |
| 0.7701388888888889 | 0 |
| 0.7708333333333334 | 0 |
| 0.7715277777777777 | 0 |
| 0.7722222222222223 | 0 |
| 0.7729166666666667 | 0 |
| 0.7736111111111111 | 0 |
| 0.7743055555555555 | 0 |
| 0.775 | 0 |
| 0.7756944444444445 | 0 |
| 0.7763888888888889 | 0 |
| 0.7770833333333332 | 0 |
| 0.7777777777777778 | 0 |
| 0.7784722222222222 | 0 |
| 0.7791666666666667 | 0 |
| 0.779861111111111 | 0 |
| 0.7805555555555556 | 0 |
| 0.78125 | 0 |
| 0.7819444444444444 | 0 |
| 0.782638888888889 | 0 |
| 0.7833333333333333 | 0 |
| 0.7840277777777778 | 0 |
| 0.7847222222222222 | 0 |
| 0.7854166666666668 | 0 |
| 0.7861111111111111 | 0 |
| 0.7868055555555555 | 0 |
| 0.7875 | 0 |
| 0.7881944444444445 | 0 |
| 0.7888888888888889 | 0 |
| 0.7895833333333333 | 0 |
| 0.7902777777777777 | 0 |
| 0.7909722222222223 | 0 |
| 0.7916666666666666 | 0 |
| 0.7923611111111111 | 0 |
| 0.7930555555555556 | 0 |
| 0.7937500000000001 | 0 |
| 0.7944444444444444 | 0 |
| 0.7951388888888888 | 0 |
| 0.7958333333333334 | 0 |
| 0.7965277777777778 | 0 |
| 0.7972222222222222 | 0 |
| 0.7979166666666666 | 0 |
| 0.7986111111111112 | 0 |
| 0.7993055555555556 | 0 |
| 0.7999999999999999 | 0 |
| 0.8006944444444444 | 0 |
| 0.8013888888888889 | 0 |
| 0.8020833333333334 | 0 |
| 0.8027777777777777 | 0 |
| 0.8034722222222223 | 0 |
| 0.8041666666666667 | 0 |
| 0.8048611111111111 | 0 |
| 0.8055555555555555 | 0 |
| 0.80625 | 0 |
| 0.8069444444444445 | 0 |
| 0.8076388888888889 | 0 |
| 0.8083333333333332 | 0 |
| 0.8090277777777778 | 0 |
| 0.8097222222222222 | 0 |
| 0.8104166666666667 | 0 |
| 0.811111111111111 | 0 |
| 0.8118055555555556 | 0 |
| 0.8125 | 0 |
| 0.8131944444444444 | 0 |
| 0.813888888888889 | 0 |
| 0.8145833333333333 | 0 |
| 0.8152777777777778 | 0 |
| 0.8159722222222222 | 0 |
| 0.8166666666666668 | 0 |
| 0.8173611111111111 | 0 |
| 0.8180555555555555 | 0 |
| 0.81875 | 0 |
| 0.8194444444444445 | 0 |
| 0.8201388888888889 | 0 |
| 0.8208333333333333 | 0 |
| 0.8215277777777777 | 0 |
| 0.8222222222222223 | 0 |
| 0.8229166666666666 | 0 |
| 0.8236111111111111 | 0 |
| 0.8243055555555556 | 0 |
| 0.8250000000000001 | 0 |
| 0.8256944444444444 | 0 |
| 0.8263888888888888 | 0 |
| 0.8270833333333334 | 0 |
| 0.8277777777777778 | 0 |
| 0.8284722222222222 | 0 |
| 0.8291666666666666 | 0 |
| 0.8298611111111112 | 0 |
| 0.8305555555555556 | 0 |
| 0.8312499999999999 | 0 |
| 0.8319444444444444 | 0 |
| 0.8326388888888889 | 0 |
| 0.8333333333333334 | 0 |
| 0.8340277777777777 | 0 |
| 0.8347222222222223 | 0 |
| 0.8354166666666667 | 0 |
| 0.8361111111111111 | 0 |
| 0.8368055555555555 | 0 |
| 0.8375 | 0 |
| 0.8381944444444445 | 0 |
| 0.8388888888888889 | 0 |
| 0.8395833333333332 | 0 |
| 0.8402777777777778 | 0 |
| 0.8409722222222222 | 0 |
| 0.8416666666666667 | 0 |
| 0.842361111111111 | 0 |
| 0.8430555555555556 | 0 |
| 0.84375 | 0 |
| 0.8444444444444444 | 0 |
| 0.845138888888889 | 0 |
| 0.8458333333333333 | 0 |
| 0.8465277777777778 | 0 |
| 0.8472222222222222 | 0 |
| 0.8479166666666668 | 0 |
| 0.8486111111111111 | 0 |
| 0.8493055555555555 | 0 |
| 0.85 | 0 |
| 0.8506944444444445 | 0 |
| 0.8513888888888889 | 0 |
| 0.8520833333333333 | 0 |
| 0.8527777777777777 | 0 |
| 0.8534722222222223 | 0 |
| 0.8541666666666666 | 0 |
| 0.8548611111111111 | 0 |
| 0.8555555555555556 | 0 |
| 0.8562500000000001 | 0 |
| 0.8569444444444444 | 0 |
| 0.8576388888888888 | 0 |
| 0.8583333333333334 | 0 |
| 0.8590277777777778 | 0 |
| 0.8597222222222222 | 0 |
| 0.8604166666666666 | 0 |
| 0.8611111111111112 | 0 |
| 0.8618055555555556 | 0 |
| 0.8624999999999999 | 0 |
| 0.8631944444444444 | 0 |
| 0.8638888888888889 | 0 |
| 0.8645833333333334 | 0 |
| 0.8652777777777777 | 0 |
| 0.8659722222222223 | 0 |
| 0.8666666666666667 | 0 |
| 0.8673611111111111 | 0 |
| 0.8680555555555555 | 0 |
| 0.86875 | 0 |
| 0.8694444444444445 | 0 |
| 0.8701388888888889 | 0 |
| 0.8708333333333332 | 0 |
| 0.8715277777777778 | 0 |
| 0.8722222222222222 | 0 |
| 0.8729166666666667 | 0 |
| 0.873611111111111 | 0 |
| 0.8743055555555556 | 0 |
| 0.875 | 0 |
| 0.8756944444444444 | 0 |
| 0.876388888888889 | 0 |
| 0.8770833333333333 | 0 |
| 0.8777777777777778 | 0 |
| 0.8784722222222222 | 0 |
| 0.8791666666666668 | 0 |
| 0.8798611111111111 | 0 |
| 0.8805555555555555 | 0 |
| 0.88125 | 0 |
| 0.8819444444444445 | 0 |
| 0.8826388888888889 | 0 |
| 0.8833333333333333 | 0 |
| 0.8840277777777777 | 0 |
| 0.8847222222222223 | 0 |
| 0.8854166666666666 | 0 |
| 0.8861111111111111 | 0 |
| 0.8868055555555556 | 0 |
| 0.8875000000000001 | 0 |
| 0.8881944444444444 | 0 |
| 0.8888888888888888 | 0 |
| 0.8895833333333334 | 0 |
| 0.8902777777777778 | 0 |
| 0.8909722222222222 | 0 |
| 0.8916666666666666 | 0 |
| 0.8923611111111112 | 0 |
| 0.8930555555555556 | 0 |
| 0.8937499999999999 | 0 |
| 0.8944444444444444 | 0 |
| 0.8951388888888889 | 0 |
| 0.8958333333333334 | 0 |
| 0.8965277777777777 | 0 |
| 0.8972222222222223 | 0 |
| 0.8979166666666667 | 0 |
| 0.8986111111111111 | 0 |
| 0.8993055555555555 | 0 |
| 0.9 | 0 |
| 0.9006944444444445 | 0 |
| 0.9013888888888889 | 0 |
| 0.9020833333333332 | 0 |
| 0.9027777777777778 | 0 |
| 0.9034722222222222 | 0 |
| 0.9041666666666667 | 0 |
| 0.904861111111111 | 0 |
| 0.9055555555555556 | 0 |
| 0.90625 | 0 |
| 0.9069444444444444 | 0 |
| 0.907638888888889 | 0 |
| 0.9083333333333333 | 0 |
| 0.9090277777777778 | 0 |
| 0.9097222222222222 | 0 |
| 0.9104166666666668 | 0 |
| 0.9111111111111111 | 0 |
| 0.9118055555555555 | 0 |
| 0.9125 | 0 |
| 0.9131944444444445 | 0 |
| 0.9138888888888889 | 0 |
| 0.9145833333333333 | 0 |
| 0.9152777777777777 | 0 |
| 0.9159722222222223 | 0 |
| 0.9166666666666666 | 0 |
| 0.9173611111111111 | 0 |
| 0.9180555555555556 | 0 |
| 0.9187500000000001 | 0 |
| 0.9194444444444444 | 0 |
| 0.9201388888888888 | 0 |
| 0.9208333333333334 | 0 |
| 0.9215277777777778 | 0 |
| 0.9222222222222222 | 0 |
| 0.9229166666666666 | 0 |
| 0.9236111111111112 | 0 |
| 0.9243055555555556 | 0 |
| 0.9249999999999999 | 0 |
| 0.9256944444444444 | 0 |
| 0.9263888888888889 | 0 |
| 0.9270833333333334 | 0 |
| 0.9277777777777777 | 0 |
| 0.9284722222222223 | 0 |
| 0.9291666666666667 | 0 |
| 0.9298611111111111 | 0 |
| 0.9305555555555555 | 0 |
| 0.93125 | 0 |
| 0.9319444444444445 | 0 |
| 0.9326388888888889 | 0 |
| 0.9333333333333332 | 0 |
| 0.9340277777777778 | 0 |
| 0.9347222222222222 | 0 |
| 0.9354166666666667 | 0 |
| 0.936111111111111 | 0 |
| 0.9368055555555556 | 0 |
| 0.9375 | 0 |
| 0.9381944444444444 | 0 |
| 0.938888888888889 | 0 |
| 0.9395833333333333 | 0 |
| 0.9402777777777778 | 0 |
| 0.9409722222222222 | 0 |
| 0.9416666666666668 | 0 |
| 0.9423611111111111 | 0 |
| 0.9430555555555555 | 0 |
| 0.94375 | 0 |
| 0.9444444444444445 | 0 |
| 0.9451388888888889 | 0 |
| 0.9458333333333333 | 0 |
| 0.9465277777777777 | 0 |
| 0.9472222222222223 | 0 |
| 0.9479166666666666 | 0 |
| 0.9486111111111111 | 0 |
| 0.9493055555555556 | 0 |
| 0.9500000000000001 | 0 |
| 0.9506944444444444 | 0 |
| 0.9513888888888888 | 0 |
| 0.9520833333333334 | 0 |
| 0.9527777777777778 | 0 |
| 0.9534722222222222 | 0 |
| 0.9541666666666666 | 0 |
| 0.9548611111111112 | 0 |
| 0.9555555555555556 | 0 |
| 0.9562499999999999 | 0 |
| 0.9569444444444444 | 0 |
| 0.9576388888888889 | 0 |
| 0.9583333333333334 | 0 |
| 0.9590277777777777 | 0 |
| 0.9597222222222223 | 0 |
| 0.9604166666666667 | 0 |
| 0.9611111111111111 | 0 |
| 0.9618055555555555 | 0 |
| 0.9625 | 0 |
| 0.9631944444444445 | 0 |
| 0.9638888888888889 | 0 |
| 0.9645833333333332 | 0 |
| 0.9652777777777778 | 0 |
| 0.9659722222222222 | 0 |
| 0.9666666666666667 | 0 |
| 0.967361111111111 | 0 |
| 0.9680555555555556 | 0 |
| 0.96875 | 0 |
| 0.9694444444444444 | 0 |
| 0.970138888888889 | 0 |
| 0.9708333333333333 | 0 |
| 0.9715277777777778 | 0 |
| 0.9722222222222222 | 0 |
| 0.9729166666666668 | 0 |
| 0.9736111111111111 | 0 |
| 0.9743055555555555 | 0 |
| 0.975 | 0 |
| 0.9756944444444445 | 0 |
| 0.9763888888888889 | 0 |
| 0.9770833333333333 | 0 |
| 0.9777777777777777 | 0 |
| 0.9784722222222223 | 0 |
| 0.9791666666666666 | 0 |
| 0.9798611111111111 | 0 |
| 0.9805555555555556 | 0 |
| 0.9812500000000001 | 0 |
| 0.9819444444444444 | 0 |
| 0.9826388888888888 | 0 |
| 0.9833333333333334 | 0 |
| 0.9840277777777778 | 0 |
| 0.9847222222222222 | 0 |
| 0.9854166666666666 | 0 |
| 0.9861111111111112 | 0 |
| 0.9868055555555556 | 0 |
| 0.9874999999999999 | 0 |
| 0.9881944444444444 | 0 |
| 0.9888888888888889 | 0 |
| 0.9895833333333334 | 0 |
| 0.9902777777777777 | 0 |
| 0.9909722222222223 | 0 |
| 0.9916666666666667 | 0 |
| 0.9923611111111111 | 0 |
| 0.9930555555555555 | 0 |
| 0.99375 | 0 |
| 0.9944444444444445 | 0 |
| 0.9951388888888889 | 0 |
| 0.9958333333333332 | 0 |
| 0.9965277777777778 | 0 |
| 0.9972222222222222 | 0 |
| 0.9979166666666667 | 0 |
| 0.998611111111111 | 0 |
| 0.9993055555555556 | 0 |